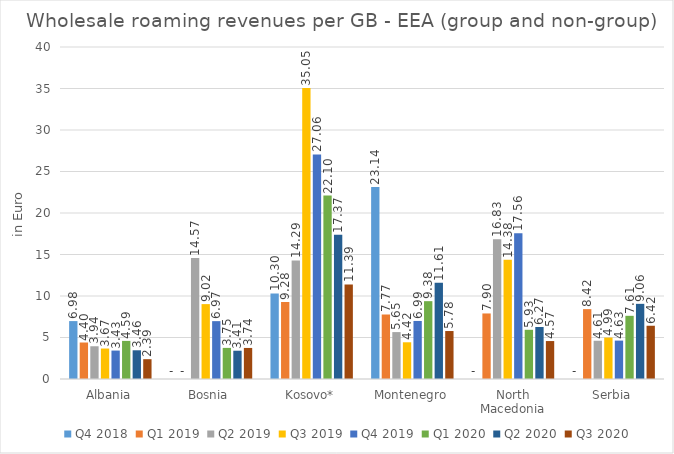
| Category | Q4 2018 | Q1 2019 | Q2 2019 | Q3 2019 | Q4 2019 | Q1 2020 | Q2 2020 | Q3 2020 |
|---|---|---|---|---|---|---|---|---|
| Albania | 6.977 | 4.397 | 3.945 | 3.67 | 3.426 | 4.592 | 3.459 | 2.387 |
| Bosnia | 0 | 0 | 14.574 | 9.023 | 6.971 | 3.747 | 3.408 | 3.741 |
| Kosovo* | 10.304 | 9.277 | 14.29 | 35.05 | 27.056 | 22.099 | 17.373 | 11.39 |
| Montenegro | 23.145 | 7.771 | 5.652 | 4.423 | 6.993 | 9.378 | 11.608 | 5.78 |
| North Macedonia | 0 | 7.896 | 16.832 | 14.375 | 17.56 | 5.928 | 6.268 | 4.572 |
| Serbia | 0 | 8.417 | 4.609 | 4.994 | 4.628 | 7.612 | 9.056 | 6.416 |